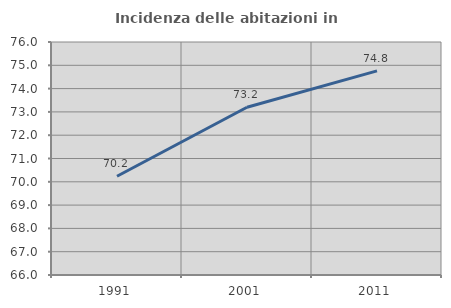
| Category | Incidenza delle abitazioni in proprietà  |
|---|---|
| 1991.0 | 70.237 |
| 2001.0 | 73.199 |
| 2011.0 | 74.761 |